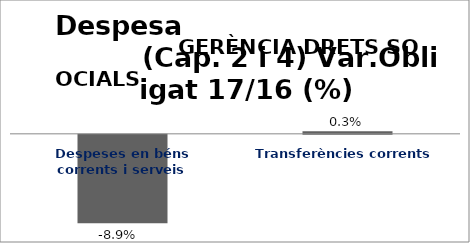
| Category | Series 0 |
|---|---|
| Despeses en béns corrents i serveis | -0.089 |
| Transferències corrents | 0.003 |